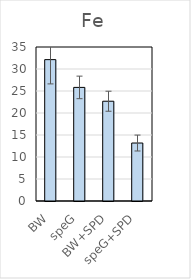
| Category | Fe |
|---|---|
| BW | 32.131 |
| speG | 25.818 |
| BW+SPD | 22.677 |
| speG+SPD | 13.175 |